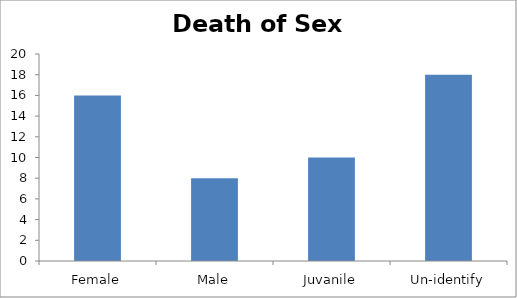
| Category | Number |
|---|---|
| Female | 16 |
| Male | 8 |
| Juvanile | 10 |
| Un-identify | 18 |